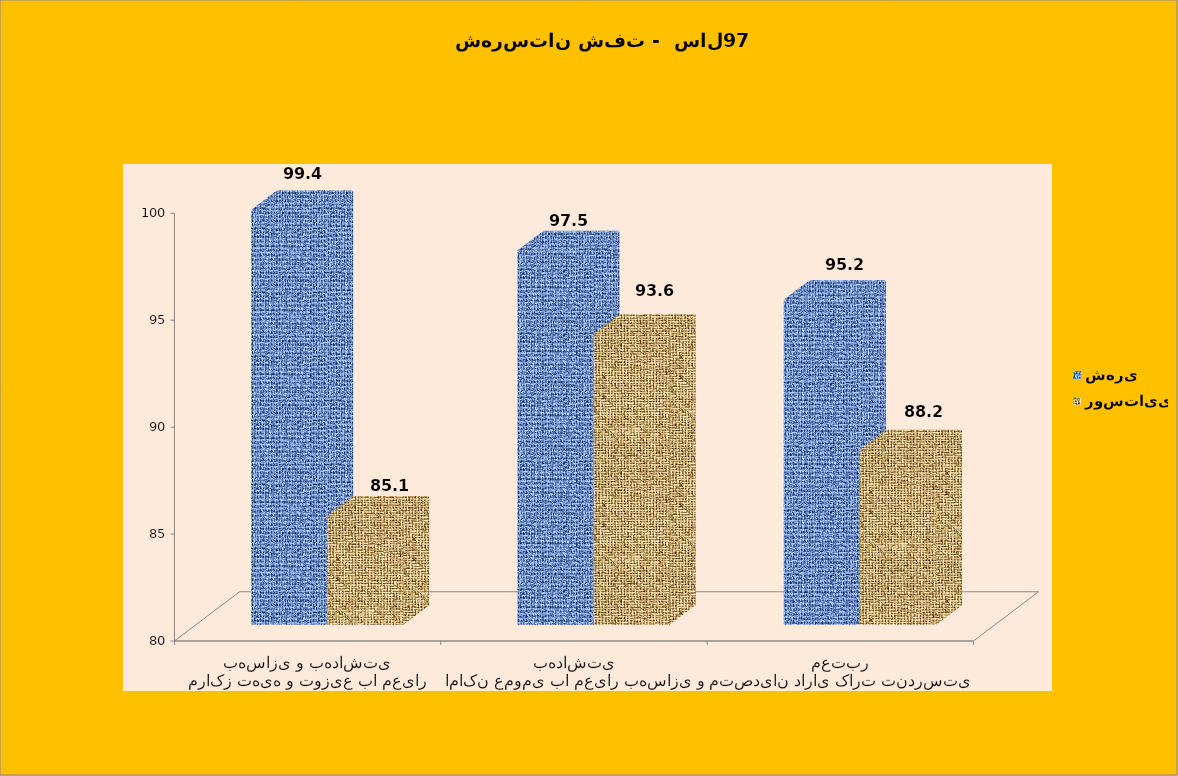
| Category | شهری | روستایی |
|---|---|---|
| مراکز تهیه و توزیع با معیار بهسازی و بهداشتی | 99.4 | 85.1 |
| اماکن عمومی با معیار بهسازی و بهداشتی | 97.5 | 93.6 |
| متصدیان دارای کارت تندرستی معتبر | 95.2 | 88.2 |